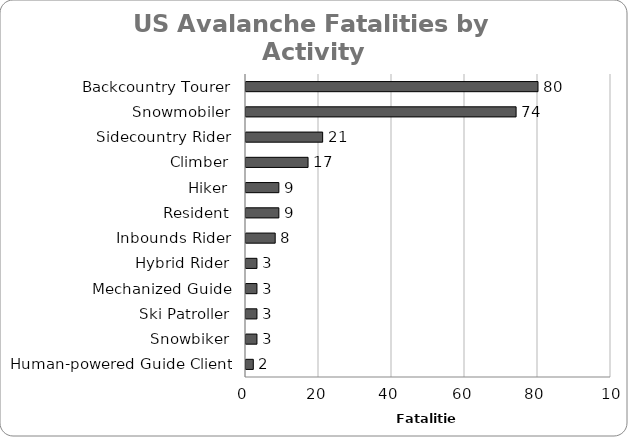
| Category | sum Killed |
|---|---|
| Backcountry Tourer | 80 |
| Snowmobiler | 74 |
| Sidecountry Rider | 21 |
| Climber | 17 |
| Hiker | 9 |
| Resident | 9 |
| Inbounds Rider | 8 |
| Hybrid Rider | 3 |
| Mechanized Guide | 3 |
| Ski Patroller | 3 |
| Snowbiker | 3 |
| Human-powered Guide Client | 2 |